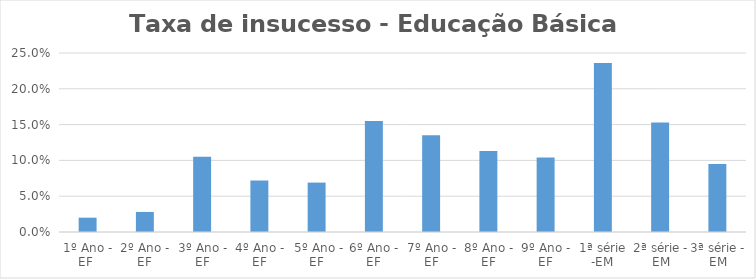
| Category | Series 0 |
|---|---|
| 1º Ano - EF  | 0.02 |
| 2º Ano - EF | 0.028 |
| 3º Ano - EF | 0.105 |
| 4º Ano - EF | 0.072 |
|  5º Ano - EF | 0.069 |
| 6º Ano - EF | 0.155 |
| 7º Ano - EF | 0.135 |
| 8º Ano - EF | 0.113 |
| 9º Ano - EF | 0.104 |
| 1ª série -EM | 0.236 |
| 2ª série - EM | 0.153 |
| 3ª série - EM | 0.095 |